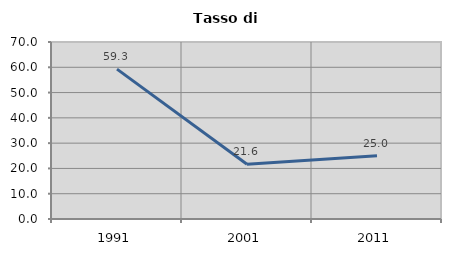
| Category | Tasso di disoccupazione   |
|---|---|
| 1991.0 | 59.268 |
| 2001.0 | 21.627 |
| 2011.0 | 25.045 |